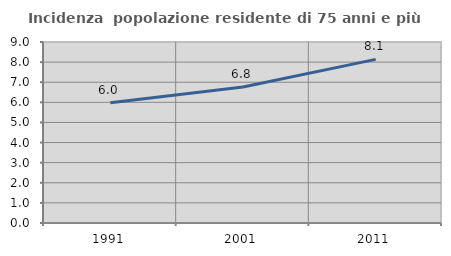
| Category | Incidenza  popolazione residente di 75 anni e più |
|---|---|
| 1991.0 | 5.984 |
| 2001.0 | 6.766 |
| 2011.0 | 8.136 |